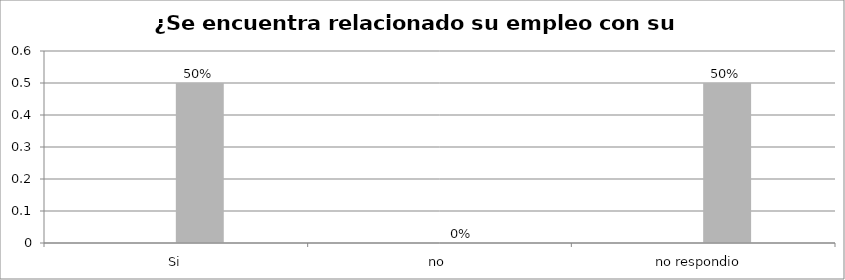
| Category | Series 0 | Series 1 | Series 2 | Series 3 |
|---|---|---|---|---|
| Si |  |  | 0.5 |  |
| no  |  |  | 0 |  |
| no respondio  |  |  | 0.5 |  |